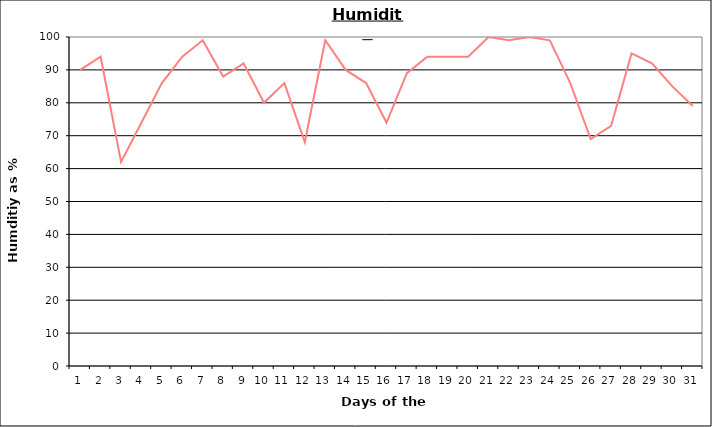
| Category | Series 0 |
|---|---|
| 0 | 90 |
| 1 | 94 |
| 2 | 62 |
| 3 | 74 |
| 4 | 86 |
| 5 | 94 |
| 6 | 99 |
| 7 | 88 |
| 8 | 92 |
| 9 | 80 |
| 10 | 86 |
| 11 | 68 |
| 12 | 99 |
| 13 | 90 |
| 14 | 86 |
| 15 | 74 |
| 16 | 89 |
| 17 | 94 |
| 18 | 94 |
| 19 | 94 |
| 20 | 100 |
| 21 | 99 |
| 22 | 100 |
| 23 | 99 |
| 24 | 86 |
| 25 | 69 |
| 26 | 73 |
| 27 | 95 |
| 28 | 92 |
| 29 | 85 |
| 30 | 79 |